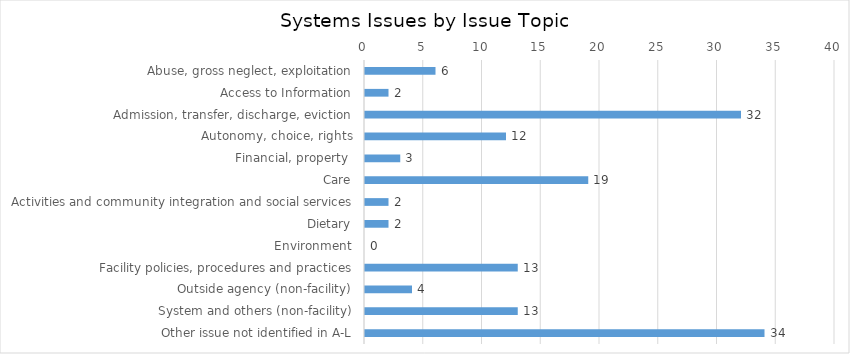
| Category | Systems issues by Issue Topic |
|---|---|
| Abuse, gross neglect, exploitation | 6 |
| Access to Information | 2 |
| Admission, transfer, discharge, eviction | 32 |
| Autonomy, choice, rights | 12 |
| Financial, property  | 3 |
| Care | 19 |
| Activities and community integration and social services | 2 |
| Dietary | 2 |
| Environment | 0 |
| Facility policies, procedures and practices | 13 |
| Outside agency (non-facility) | 4 |
| System and others (non-facility) | 13 |
| Other issue not identified in A-L | 34 |